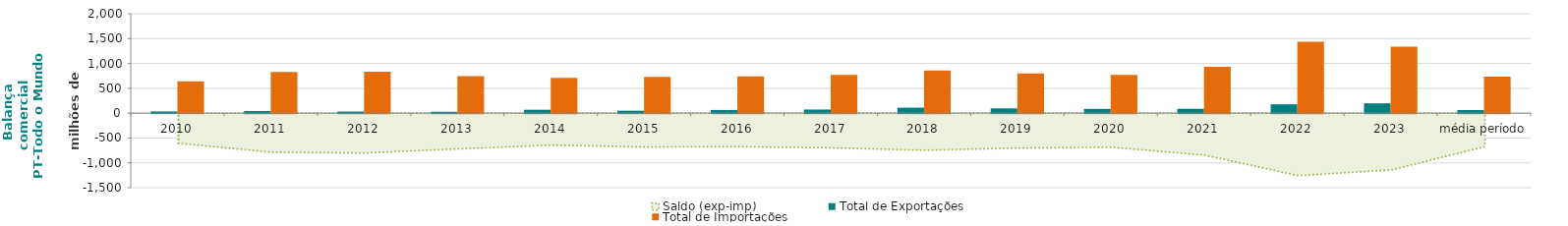
| Category | Total de Exportações  | Total de Importações  |
|---|---|---|
| 2010 | 34.269 | 640.042 |
| 2011 | 42.44 | 829.525 |
| 2012 | 32.005 | 834.33 |
| 2013 | 27.705 | 746.74 |
| 2014 | 67.868 | 710.988 |
| 2015 | 48.616 | 729.366 |
| 2016 | 63.8 | 737.446 |
| 2017 | 72.833 | 770.613 |
| 2018 | 109.722 | 856.184 |
| 2019 | 95.873 | 796.616 |
| 2020 | 85.553 | 771.514 |
| 2021 | 87.652 | 934.152 |
| 2022 | 177.411 | 1434.453 |
| 2023 | 197.932 | 1338.749 |
| média período | 62.476 | 736.079 |